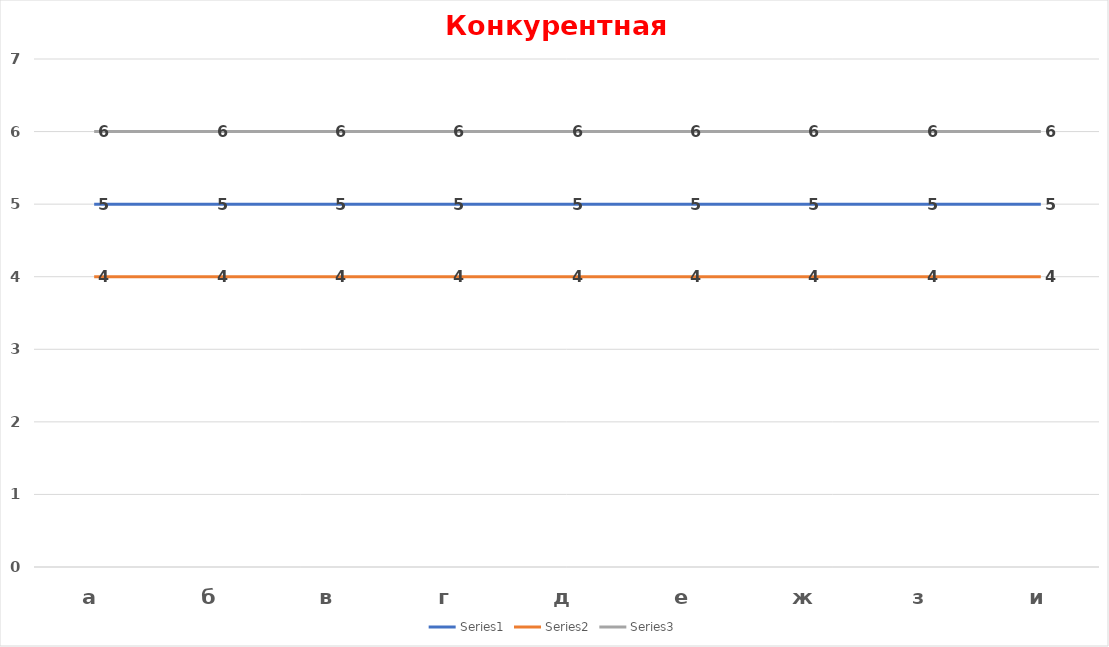
| Category | Series 0 | Series 1 | Series 2 |
|---|---|---|---|
| а | 5 | 4 | 6 |
| б | 5 | 4 | 6 |
| в | 5 | 4 | 6 |
| г | 5 | 4 | 6 |
| д | 5 | 4 | 6 |
| е | 5 | 4 | 6 |
| ж | 5 | 4 | 6 |
| з | 5 | 4 | 6 |
| и | 5 | 4 | 6 |